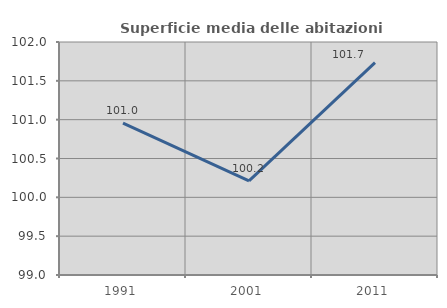
| Category | Superficie media delle abitazioni occupate |
|---|---|
| 1991.0 | 100.957 |
| 2001.0 | 100.212 |
| 2011.0 | 101.735 |